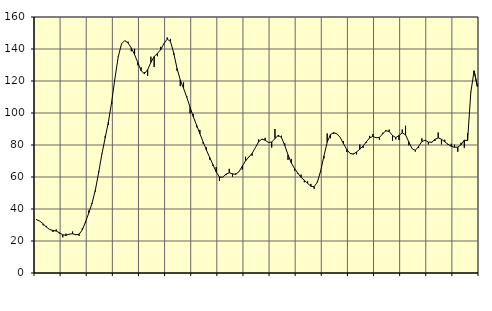
| Category | Piggar | Series 1 |
|---|---|---|
| nan | 33.7 | 33.27 |
| 87.0 | 32.4 | 32.41 |
| 87.0 | 29.8 | 30.77 |
| 87.0 | 29.4 | 28.66 |
| nan | 27.3 | 27.15 |
| 88.0 | 25.6 | 26.6 |
| 88.0 | 27.2 | 26.2 |
| 88.0 | 24.6 | 25.16 |
| nan | 22.3 | 23.83 |
| 89.0 | 24.6 | 23.51 |
| 89.0 | 24.2 | 24.29 |
| 89.0 | 25.9 | 24.52 |
| nan | 23.7 | 23.93 |
| 90.0 | 23.2 | 24.19 |
| 90.0 | 28 | 26.99 |
| 90.0 | 31.2 | 32.1 |
| nan | 39.1 | 37.62 |
| 91.0 | 43.3 | 43.76 |
| 91.0 | 50.9 | 52 |
| 91.0 | 63.6 | 62.83 |
| nan | 74.6 | 74.41 |
| 92.0 | 85.7 | 84.52 |
| 92.0 | 92.6 | 94.58 |
| 92.0 | 105.6 | 107.08 |
| nan | 121.9 | 121.93 |
| 93.0 | 135.5 | 135.21 |
| 93.0 | 143.1 | 143.23 |
| 93.0 | 145.2 | 145.28 |
| nan | 144.6 | 143.77 |
| 94.0 | 138.6 | 140.71 |
| 94.0 | 140.1 | 136.51 |
| 94.0 | 129.8 | 131.49 |
| nan | 128.5 | 126.51 |
| 95.0 | 125.5 | 124.56 |
| 95.0 | 123.2 | 127.06 |
| 95.0 | 135.2 | 131.61 |
| nan | 128.8 | 135.3 |
| 96.0 | 135.5 | 137.23 |
| 96.0 | 141.3 | 139.59 |
| 96.0 | 143.6 | 143.42 |
| nan | 147.2 | 146.19 |
| 97.0 | 146.3 | 144.7 |
| 97.0 | 136.4 | 137.43 |
| 97.0 | 126.5 | 127.88 |
| nan | 116.8 | 120.71 |
| 98.0 | 119.1 | 115.44 |
| 98.0 | 110.5 | 109.83 |
| 98.0 | 99.8 | 103.6 |
| nan | 99.4 | 97.58 |
| 99.0 | 91.1 | 92.44 |
| 99.0 | 89.4 | 87.06 |
| 99.0 | 80.9 | 81.87 |
| nan | 78.5 | 76.89 |
| 0.0 | 70.9 | 72.23 |
| 0.0 | 66.9 | 67.76 |
| 0.0 | 66.2 | 63.17 |
| nan | 57.5 | 59.96 |
| 1.0 | 60 | 59.9 |
| 1.0 | 61.2 | 61.82 |
| 1.0 | 65.1 | 62.67 |
| nan | 60.2 | 61.98 |
| 2.0 | 62.2 | 61.65 |
| 2.0 | 63.3 | 63.36 |
| 2.0 | 64.6 | 66.81 |
| nan | 72.7 | 70.11 |
| 3.0 | 72.6 | 72.47 |
| 3.0 | 73.3 | 74.76 |
| 3.0 | 78.4 | 78.36 |
| nan | 83.5 | 82.03 |
| 4.0 | 83.3 | 83.7 |
| 4.0 | 84.5 | 82.99 |
| 4.0 | 81.5 | 81.59 |
| nan | 78.4 | 81.84 |
| 5.0 | 90 | 84.03 |
| 5.0 | 85.2 | 86.05 |
| 5.0 | 85.8 | 84.65 |
| nan | 81.1 | 79.73 |
| 6.0 | 70.7 | 73.86 |
| 6.0 | 71.3 | 68.84 |
| 6.0 | 64 | 65.33 |
| nan | 61.9 | 62.37 |
| 7.0 | 61.5 | 59.78 |
| 7.0 | 56.7 | 57.97 |
| 7.0 | 57.3 | 56.04 |
| nan | 55.7 | 54.23 |
| 8.0 | 52.6 | 53.98 |
| 8.0 | 57.5 | 56.78 |
| 8.0 | 63.3 | 63.81 |
| nan | 71.6 | 73.12 |
| 9.0 | 87.2 | 81.73 |
| 9.0 | 84.2 | 86.56 |
| 9.0 | 86.9 | 87.7 |
| nan | 86.9 | 86.98 |
| 10.0 | 84.6 | 84.69 |
| 10.0 | 82.4 | 80.8 |
| 10.0 | 75.6 | 77.17 |
| nan | 74.8 | 74.76 |
| 11.0 | 74.7 | 74.31 |
| 11.0 | 74.1 | 75.65 |
| 11.0 | 80.3 | 77.38 |
| nan | 78.2 | 79.42 |
| 12.0 | 81.3 | 82 |
| 12.0 | 85.7 | 84.43 |
| 12.0 | 86.9 | 85.36 |
| nan | 84.4 | 84.52 |
| 13.0 | 83.3 | 84.71 |
| 13.0 | 87.7 | 87.05 |
| 13.0 | 89.4 | 88.94 |
| nan | 89.6 | 88.38 |
| 14.0 | 82.6 | 85.95 |
| 14.0 | 83.5 | 84.62 |
| 14.0 | 83.1 | 85.94 |
| nan | 89.7 | 87.57 |
| 15.0 | 92 | 86.36 |
| 15.0 | 79.8 | 81.96 |
| 15.0 | 77.7 | 77.68 |
| nan | 75.9 | 76.68 |
| 16.0 | 78.2 | 79.13 |
| 16.0 | 84.2 | 82.16 |
| 16.0 | 82.7 | 82.99 |
| nan | 80.3 | 81.79 |
| 17.0 | 81.4 | 81.76 |
| 17.0 | 82.5 | 83.46 |
| 17.0 | 87.8 | 84.46 |
| nan | 80.4 | 83.61 |
| 18.0 | 83.3 | 82.04 |
| 18.0 | 80 | 80.48 |
| 18.0 | 80.8 | 79.16 |
| nan | 80.2 | 78.61 |
| 19.0 | 75.8 | 78.66 |
| 19.0 | 81.4 | 80.14 |
| 19.0 | 78.2 | 83.05 |
| nan | 87.4 | 82.76 |
| 20.0 | 113.2 | 113 |
| 20.0 | 124.7 | 126.36 |
| 20.0 | 117.8 | 116.62 |